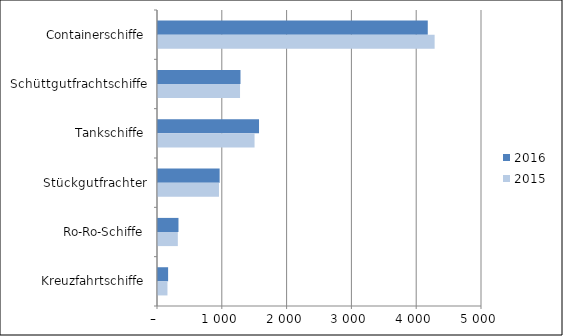
| Category | 2016 | 2015 |
|---|---|---|
| Containerschiffe | 4163 | 4269 |
| Schüttgutfrachtschiffe | 1273 | 1266 |
| Tankschiffe | 1559 | 1490 |
| Stückgutfrachter | 951 | 941 |
| Ro-Ro-Schiffe | 316 | 306 |
| Kreuzfahrtschiffe | 156 | 146 |